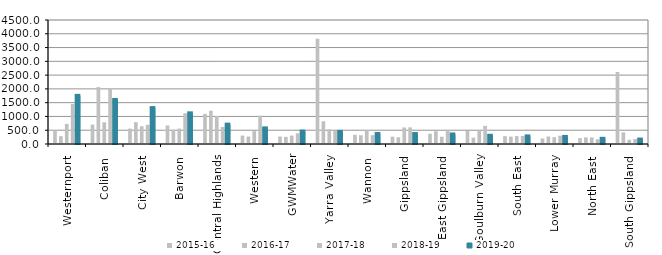
| Category | 2015-16 | 2016-17 | 2017-18 | 2018-19 | 2019-20 |
|---|---|---|---|---|---|
| Westernport  | 490.996 | 282.633 | 729.938 | 1451.118 | 1746.615 |
| Coliban  | 705.263 | 2065.756 | 789.182 | 2020.653 | 1598.887 |
| City West  | 558.82 | 790.85 | 642.448 | 697.028 | 1302.423 |
| Barwon  | 672.824 | 517.383 | 557.536 | 1117 | 1112.623 |
| Central Highlands  | 1094.523 | 1207.644 | 1018.349 | 615.27 | 702.131 |
| Western  | 304.444 | 270.5 | 467.795 | 1028.05 | 566.682 |
| GWMWater | 270.228 | 259.358 | 306.037 | 388.392 | 450.488 |
| Yarra Valley  | 3819.12 | 824.18 | 534.077 | 485.75 | 439.076 |
| Wannon  | 333.167 | 317.885 | 496.659 | 323.024 | 363.85 |
| Gippsland  | 265.139 | 242.522 | 599.632 | 604.762 | 361.333 |
| East Gippsland  | 372.333 | 464 | 262.8 | 495.667 | 346 |
| Goulburn Valley  | 473.148 | 230.482 | 487.173 | 657.018 | 297.876 |
| South East  | 284.427 | 268.604 | 287.134 | 292.04 | 275.257 |
| Lower Murray  | 200.913 | 271.675 | 247.686 | 300.915 | 255.761 |
| North East  | 215.455 | 241.053 | 237.625 | 170.222 | 188.1 |
| South Gippsland  | 2613.366 | 419.415 | 151.824 | 178.429 | 161.176 |